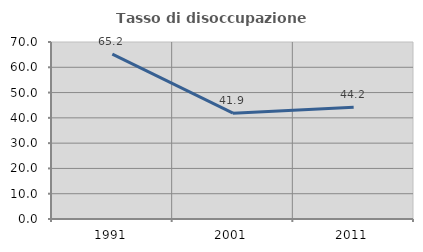
| Category | Tasso di disoccupazione giovanile  |
|---|---|
| 1991.0 | 65.169 |
| 2001.0 | 41.86 |
| 2011.0 | 44.186 |